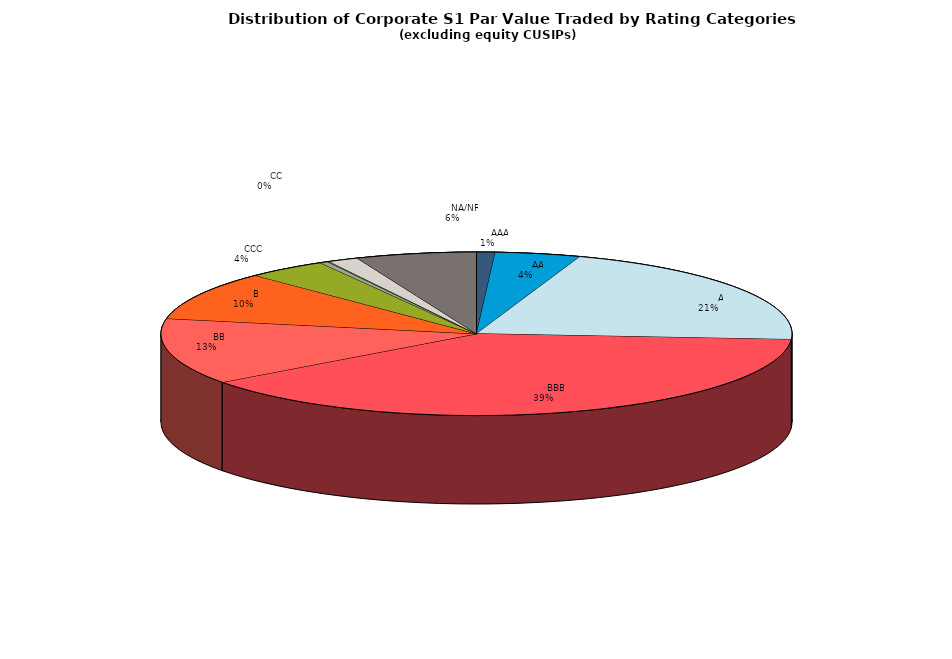
| Category | Series 0 |
|---|---|
|         AAA | 326549581.984 |
|         AA | 1499222100.204 |
|         A | 7125452147.484 |
|         BBB | 13286081523.609 |
|         BB | 4481979548.376 |
|         B | 3305919336.291 |
|         CCC | 1407935443.594 |
|         CC | 140204503.802 |
|         C | 36133399.345 |
|         D | 528868888.218 |
|         NA/NR | 2118472491.725 |